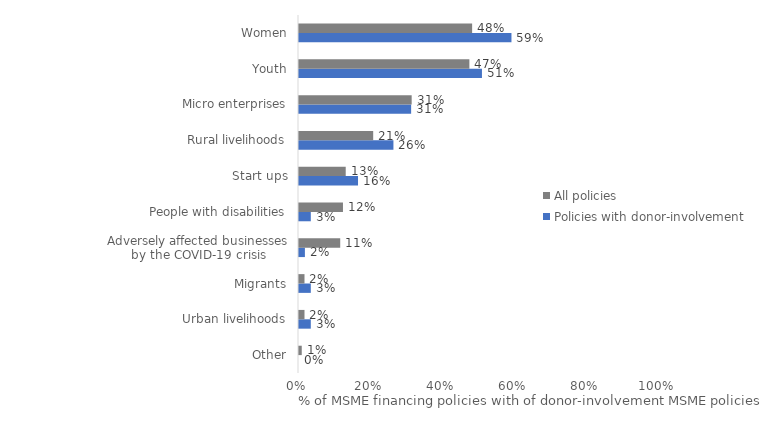
| Category | Policies with donor-involvement | All policies |
|---|---|---|
| Other | 0 | 0.008 |
| Urban livelihoods | 0.033 | 0.015 |
| Migrants | 0.033 | 0.015 |
| Adversely affected businesses by the COVID-19 crisis | 0.016 | 0.115 |
| People with disabilities | 0.033 | 0.122 |
| Start ups | 0.164 | 0.13 |
| Rural livelihoods | 0.262 | 0.206 |
| Micro enterprises | 0.311 | 0.313 |
| Youth | 0.508 | 0.473 |
| Women | 0.59 | 0.481 |